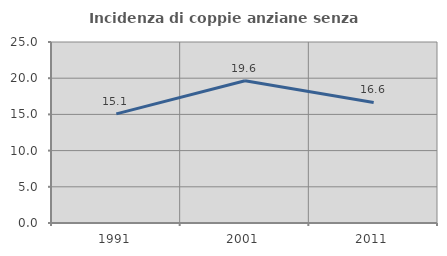
| Category | Incidenza di coppie anziane senza figli  |
|---|---|
| 1991.0 | 15.072 |
| 2001.0 | 19.647 |
| 2011.0 | 16.646 |